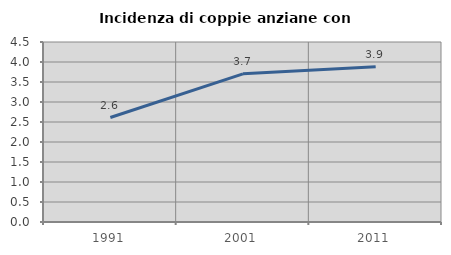
| Category | Incidenza di coppie anziane con figli |
|---|---|
| 1991.0 | 2.612 |
| 2001.0 | 3.704 |
| 2011.0 | 3.879 |